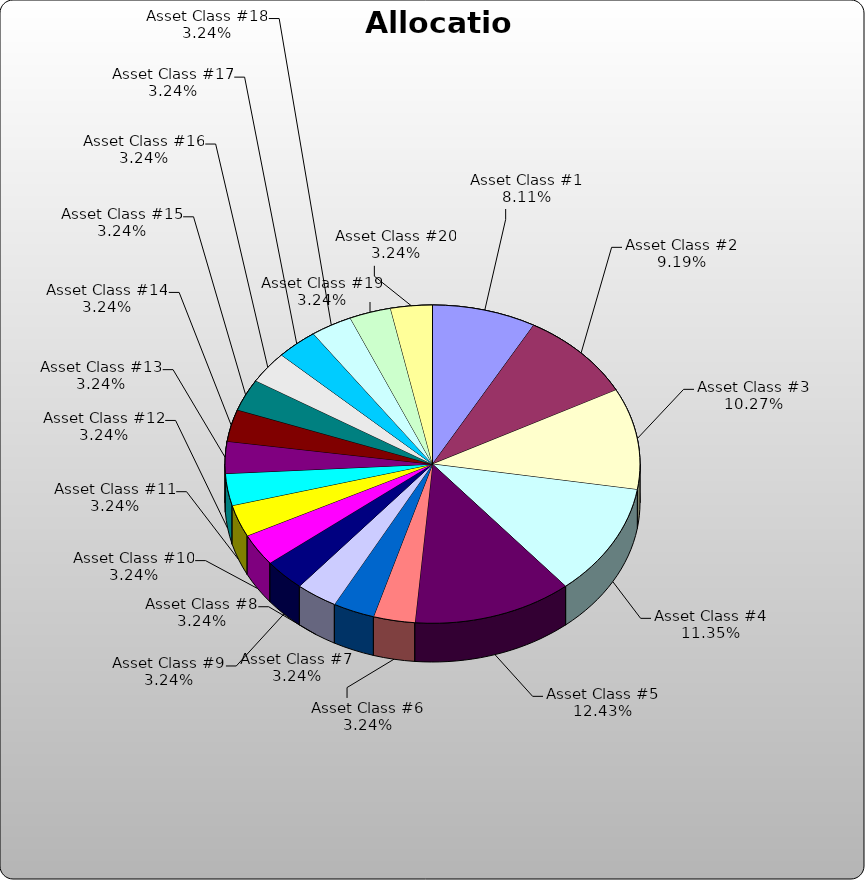
| Category | Series 0 |
|---|---|
| Asset Class #1 | 0.081 |
| Asset Class #2 | 0.092 |
| Asset Class #3 | 0.103 |
| Asset Class #4 | 0.114 |
| Asset Class #5 | 0.124 |
| Asset Class #6 | 0.032 |
| Asset Class #7 | 0.032 |
| Asset Class #8 | 0.032 |
| Asset Class #9 | 0.032 |
| Asset Class #10 | 0.032 |
| Asset Class #11 | 0.032 |
| Asset Class #12 | 0.032 |
| Asset Class #13 | 0.032 |
| Asset Class #14 | 0.032 |
| Asset Class #15 | 0.032 |
| Asset Class #16 | 0.032 |
| Asset Class #17 | 0.032 |
| Asset Class #18 | 0.032 |
| Asset Class #19 | 0.032 |
| Asset Class #20 | 0.032 |